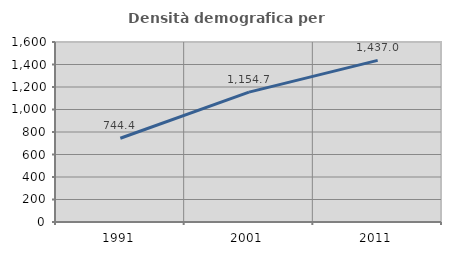
| Category | Densità demografica |
|---|---|
| 1991.0 | 744.413 |
| 2001.0 | 1154.747 |
| 2011.0 | 1436.999 |